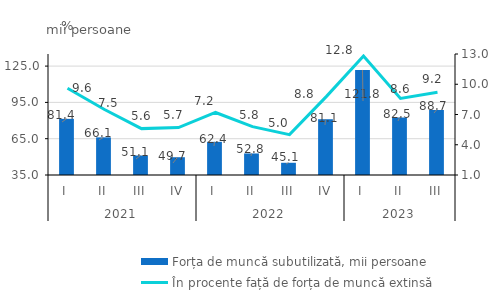
| Category | Forța de muncă subutilizată, mii persoane |
|---|---|
| 0 | 81.4 |
| 1 | 66.1 |
| 2 | 51.1 |
| 3 | 49.7 |
| 4 | 62.4 |
| 5 | 52.8 |
| 6 | 45.1 |
| 7 | 81.1 |
| 8 | 121.8 |
| 9 | 82.5 |
| 10 | 88.7 |